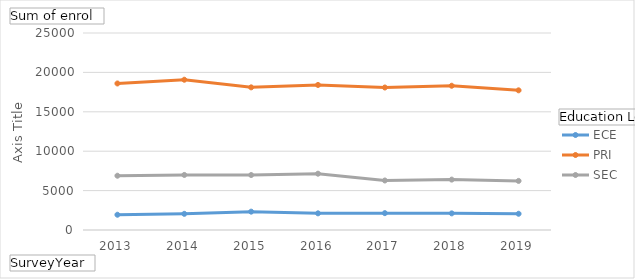
| Category | ECE | PRI | SEC |
|---|---|---|---|
| 2013 | 1937 | 18595 | 6888 |
| 2014 | 2052 | 19070 | 6987 |
| 2015 | 2328 | 18103 | 6976 |
| 2016 | 2114 | 18407 | 7145 |
| 2017 | 2140 | 18083 | 6283 |
| 2018 | 2110 | 18306 | 6395 |
| 2019 | 2061 | 17725 | 6229 |